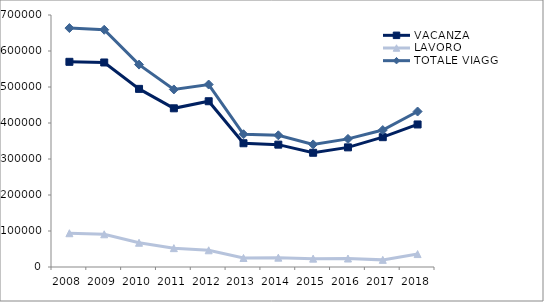
| Category | VACANZA | LAVORO | TOTALE VIAGGI |
|---|---|---|---|
| 2008 | 569942 | 93804 | 663746 |
| 2009 | 568103 | 90861 | 658964 |
| 2010 | 494811 | 67399 | 562211 |
| 2011 | 440821 | 52379 | 493200 |
| 2012 | 460442 | 46426 | 506868 |
| 2013 | 343728 | 25028 | 368756 |
| 2014 | 339850 | 25932 | 365782 |
| 2015 | 317307 | 23250 | 340557 |
| 2016 | 332304 | 23545 | 355849 |
| 2017 | 360609 | 19802 | 380411 |
| 2018 | 395962 | 35931 | 431893 |